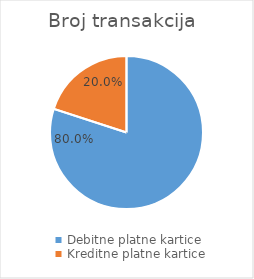
| Category | Broj transakcija  |
|---|---|
| Debitne platne kartice | 355980943 |
| Kreditne platne kartice | 88963106 |